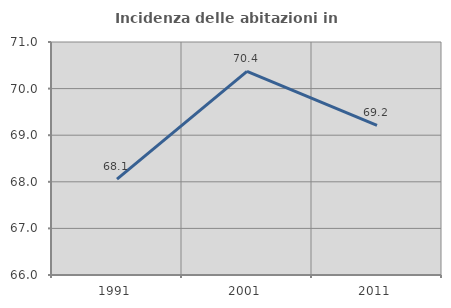
| Category | Incidenza delle abitazioni in proprietà  |
|---|---|
| 1991.0 | 68.056 |
| 2001.0 | 70.37 |
| 2011.0 | 69.209 |